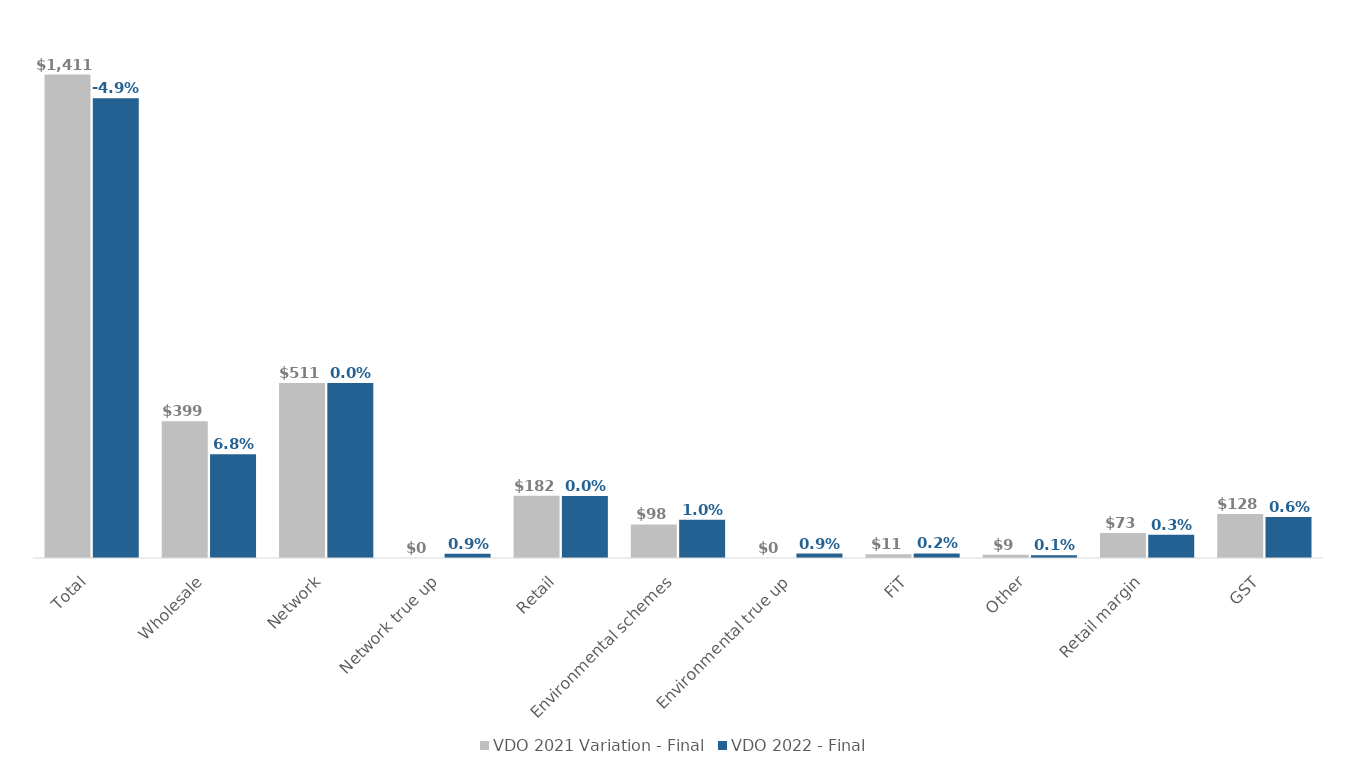
| Category | VDO 2021 Variation - Final | VDO 2022 - Final |
|---|---|---|
| Total | 1411.375 | 1342 |
| Wholesale | 399.439 | 303.142 |
| Network | 510.785 | 510.785 |
| Network true up | 0 | 12.531 |
| Retail | 181.759 | 181.376 |
| Environmental schemes | 97.928 | 111.915 |
| Environmental true up | 0 | 13.08 |
| FiT | 10.849 | 13.338 |
| Other | 9.226 | 7.824 |
| Retail margin | 73.083 | 68.154 |
| GST | 128.307 | 119.653 |